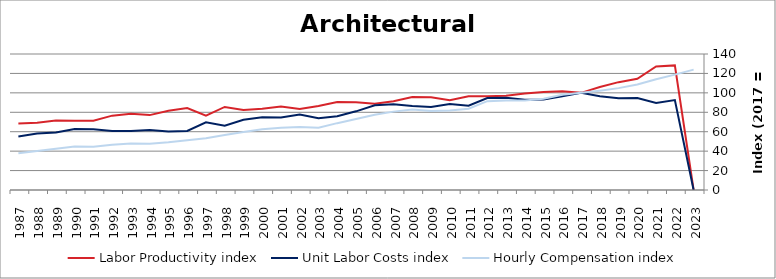
| Category | Labor Productivity index | Unit Labor Costs index | Hourly Compensation index |
|---|---|---|---|
| 2023.0 | 0 | 0 | 123.949 |
| 2022.0 | 128.285 | 92.555 | 118.734 |
| 2021.0 | 127.141 | 89.62 | 113.944 |
| 2020.0 | 114.538 | 94.782 | 108.562 |
| 2019.0 | 111.019 | 94.454 | 104.861 |
| 2018.0 | 106.037 | 96.412 | 102.232 |
| 2017.0 | 100 | 100 | 100 |
| 2016.0 | 101.564 | 96.545 | 98.055 |
| 2015.0 | 100.812 | 93.142 | 93.898 |
| 2014.0 | 99.221 | 92.882 | 92.158 |
| 2013.0 | 97.03 | 95.08 | 92.256 |
| 2012.0 | 96.592 | 94.687 | 91.46 |
| 2011.0 | 96.418 | 86.751 | 83.643 |
| 2010.0 | 92.346 | 88.586 | 81.805 |
| 2009.0 | 95.376 | 85.36 | 81.413 |
| 2008.0 | 95.717 | 86.589 | 82.881 |
| 2007.0 | 91.347 | 88.324 | 80.68 |
| 2006.0 | 88.67 | 87.319 | 77.426 |
| 2005.0 | 90.275 | 80.983 | 73.108 |
| 2004.0 | 90.661 | 75.904 | 68.815 |
| 2003.0 | 86.553 | 73.978 | 64.03 |
| 2002.0 | 83.316 | 77.693 | 64.73 |
| 2001.0 | 85.974 | 74.59 | 64.128 |
| 2000.0 | 83.61 | 74.795 | 62.535 |
| 1999.0 | 82.317 | 72.394 | 59.592 |
| 1998.0 | 85.506 | 66.242 | 56.641 |
| 1997.0 | 76.566 | 69.609 | 53.297 |
| 1996.0 | 84.416 | 60.715 | 51.253 |
| 1995.0 | 81.631 | 60.238 | 49.173 |
| 1994.0 | 77.098 | 61.714 | 47.58 |
| 1993.0 | 78.518 | 60.836 | 47.768 |
| 1992.0 | 76.53 | 60.763 | 46.502 |
| 1991.0 | 71.376 | 62.549 | 44.645 |
| 1990.0 | 71.309 | 62.874 | 44.834 |
| 1989.0 | 71.644 | 59.225 | 42.431 |
| 1988.0 | 69.124 | 58.206 | 40.234 |
| 1987.0 | 68.49 | 55.126 | 37.756 |